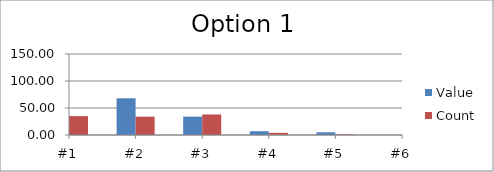
| Category | Value | Count |
|---|---|---|
| #1 | 100 | 35 |
| #2 | 68 | 34 |
| #3 | 34 | 38 |
| #4 | 7 | 4 |
| #5 | 5 | 1 |
| #6 | 0 | 46 |